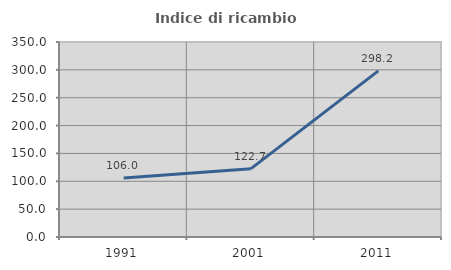
| Category | Indice di ricambio occupazionale  |
|---|---|
| 1991.0 | 106.042 |
| 2001.0 | 122.68 |
| 2011.0 | 298.235 |